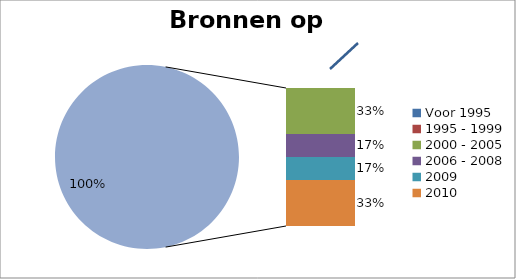
| Category | Series 0 |
|---|---|
| Voor 1995 | 0 |
| 1995 - 1999 | 0 |
| 2000 - 2005 | 4 |
| 2006 - 2008 | 2 |
| 2009 | 2 |
| 2010 | 4 |